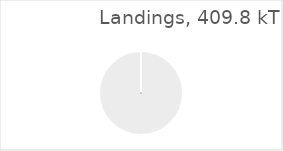
| Category | BoBiscay & Iberia |
|---|---|
| 0 | 409.756 |